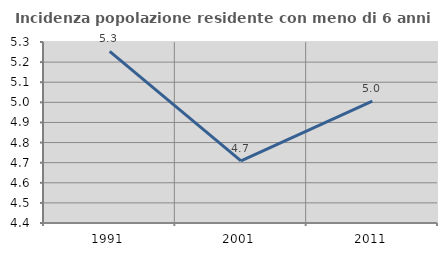
| Category | Incidenza popolazione residente con meno di 6 anni |
|---|---|
| 1991.0 | 5.253 |
| 2001.0 | 4.709 |
| 2011.0 | 5.006 |